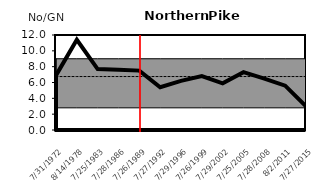
| Category | 3rd | 1st | No/Net | AVG |
|---|---|---|---|---|
| 7/31/72 | 9 | 2.8 | 6.9 | 6.754 |
| 8/14/78 | 9 | 2.8 | 11.4 | 6.754 |
| 7/25/83 | 9 | 2.8 | 7.7 | 6.754 |
| 7/28/86 | 9 | 2.8 | 7.6 | 6.754 |
| 7/26/89 | 9 | 2.8 | 7.5 | 6.754 |
| 7/27/92 | 9 | 2.8 | 5.4 | 6.754 |
| 7/29/96 | 9 | 2.8 | 6.2 | 6.754 |
| 7/26/99 | 9 | 2.8 | 6.8 | 6.754 |
| 7/29/02 | 9 | 2.8 | 5.9 | 6.754 |
| 7/25/05 | 9 | 2.8 | 7.3 | 6.754 |
| 7/28/08 | 9 | 2.8 | 6.5 | 6.754 |
| 8/2/11 | 9 | 2.8 | 5.6 | 6.754 |
| 7/27/15 | 9 | 2.8 | 3 | 6.754 |